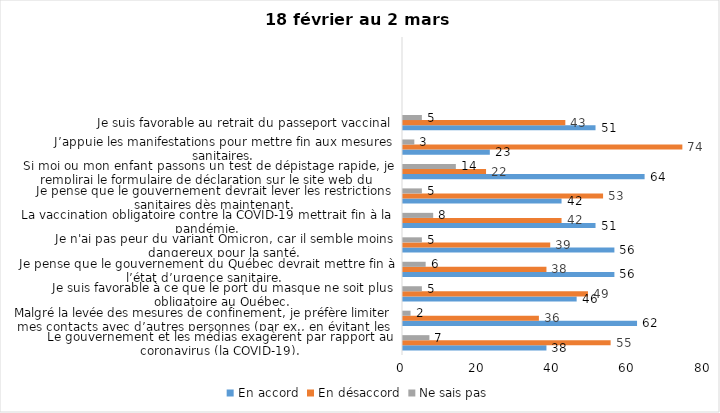
| Category | En accord | En désaccord | Ne sais pas |
|---|---|---|---|
| Le gouvernement et les médias exagèrent par rapport au coronavirus (la COVID-19). | 38 | 55 | 7 |
| Malgré la levée des mesures de confinement, je préfère limiter mes contacts avec d’autres personnes (par ex., en évitant les activités sociales et de groupes) | 62 | 36 | 2 |
| Je suis favorable à ce que le port du masque ne soit plus obligatoire au Québec. | 46 | 49 | 5 |
| Je pense que le gouvernement du Québec devrait mettre fin à l’état d’urgence sanitaire.  | 56 | 38 | 6 |
| Je n'ai pas peur du variant Omicron, car il semble moins dangereux pour la santé. | 56 | 39 | 5 |
| La vaccination obligatoire contre la COVID-19 mettrait fin à la pandémie. | 51 | 42 | 8 |
| Je pense que le gouvernement devrait lever les restrictions sanitaires dès maintenant. | 42 | 53 | 5 |
| Si moi ou mon enfant passons un test de dépistage rapide, je remplirai le formulaire de déclaration sur le site web du Gouvernement du Québec. | 64 | 22 | 14 |
| J’appuie les manifestations pour mettre fin aux mesures sanitaires. | 23 | 74 | 3 |
| Je suis favorable au retrait du passeport vaccinal | 51 | 43 | 5 |